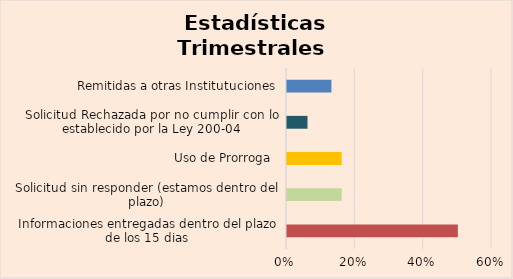
| Category | Series 0 |
|---|---|
| Informaciones entregadas dentro del plazo de los 15 dias | 0.5 |
| Solicitud sin responder (estamos dentro del plazo) | 0.16 |
| Uso de Prorroga  | 0.16 |
| Solicitud Rechazada por no cumplir con lo establecido por la Ley 200-04 | 0.06 |
| Remitidas a otras Institutuciones | 0.13 |